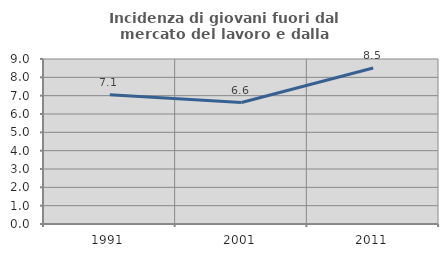
| Category | Incidenza di giovani fuori dal mercato del lavoro e dalla formazione  |
|---|---|
| 1991.0 | 7.052 |
| 2001.0 | 6.627 |
| 2011.0 | 8.511 |